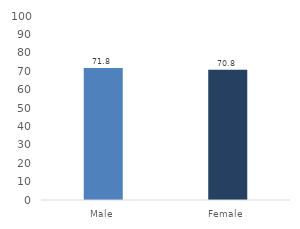
| Category | Series 0 |
|---|---|
| Male | 71.784 |
| Female | 70.766 |